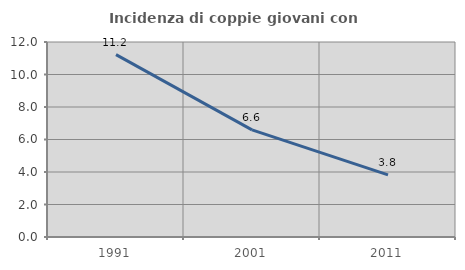
| Category | Incidenza di coppie giovani con figli |
|---|---|
| 1991.0 | 11.225 |
| 2001.0 | 6.595 |
| 2011.0 | 3.825 |